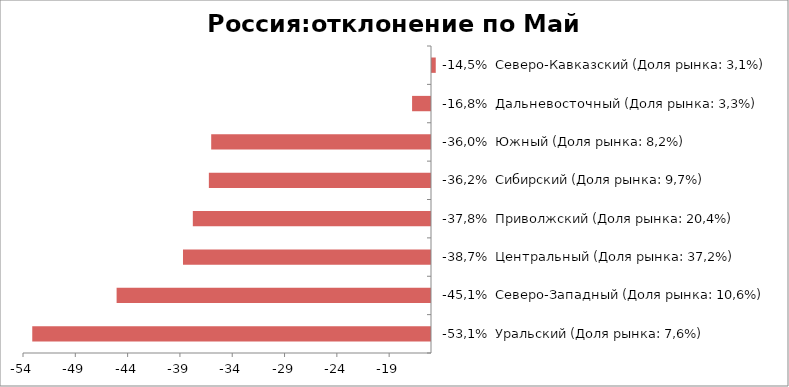
| Category | Россия:отклонение по Май 2015-2014 |
|---|---|
| -53,1%  Уральский (Доля рынка: 7,6%) | -53.115 |
| -45,1%  Северо-Западный (Доля рынка: 10,6%) | -45.052 |
| -38,7%  Центральный (Доля рынка: 37,2%) | -38.707 |
| -37,8%  Приволжский (Доля рынка: 20,4%) | -37.766 |
| -36,2%  Сибирский (Доля рынка: 9,7%) | -36.234 |
| -36,0%  Южный (Доля рынка: 8,2%) | -36.011 |
| -16,8%  Дальневосточный (Доля рынка: 3,3%) | -16.809 |
| -14,5%  Северо-Кавказский (Доля рынка: 3,1%) | -14.545 |